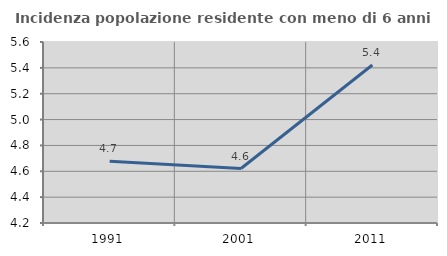
| Category | Incidenza popolazione residente con meno di 6 anni |
|---|---|
| 1991.0 | 4.677 |
| 2001.0 | 4.621 |
| 2011.0 | 5.422 |